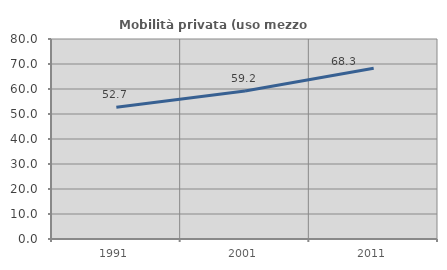
| Category | Mobilità privata (uso mezzo privato) |
|---|---|
| 1991.0 | 52.721 |
| 2001.0 | 59.181 |
| 2011.0 | 68.274 |